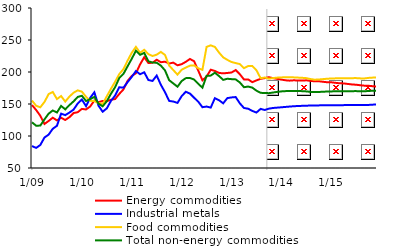
| Category | Energy commodities | Industrial metals | Food commodities | Total non-energy commodities |
|---|---|---|---|---|
|  1/09 | 148.368 | 84.244 | 155.29 | 121.375 |
| 2 | 140.587 | 81.429 | 147.196 | 116.049 |
| 3 | 131.575 | 85.939 | 144.868 | 116.307 |
| 4 | 118.821 | 97.654 | 153.203 | 125.93 |
| 5 | 123.49 | 102.128 | 165.445 | 134.898 |
| 6 | 128.606 | 111.311 | 168.793 | 139.885 |
| 7 | 124.331 | 115.961 | 157.75 | 136.723 |
| 8 | 128.514 | 134.928 | 162.407 | 147.012 |
| 9 | 125.026 | 132.617 | 153.77 | 141.634 |
| 10 | 129.397 | 136.603 | 161.586 | 148.247 |
| 11 | 135.879 | 141.211 | 167.652 | 154.078 |
| 12 | 137.215 | 150.766 | 171.339 | 161.026 |
|  1/10 | 142.356 | 156.985 | 169.298 | 162.848 |
| 2 | 141.46 | 146.691 | 161.28 | 154.731 |
| 3 | 146.147 | 159.641 | 154.948 | 157.505 |
| 4 | 155.508 | 168.291 | 154.706 | 161.124 |
| 5 | 152.816 | 147.383 | 151.358 | 150.602 |
| 6 | 154.771 | 137.917 | 150.12 | 146.431 |
| 7 | 154.405 | 143.15 | 162.09 | 154.366 |
| 8 | 156.612 | 154.951 | 173.778 | 166.045 |
| 9 | 157.739 | 163.172 | 184.769 | 176.337 |
| 10 | 165.782 | 176.163 | 196.798 | 190.619 |
| 11 | 172.845 | 175.509 | 204.537 | 197.056 |
| 12 | 186.122 | 184.213 | 217.756 | 208.974 |
|  1/11 | 193.869 | 192.364 | 230.087 | 220.692 |
| 2 | 197.964 | 201.464 | 239.263 | 233.195 |
| 3 | 211.893 | 196.53 | 230.085 | 226.858 |
| 4 | 223.102 | 199.532 | 234.656 | 229.779 |
| 5 | 213.988 | 187.434 | 227.889 | 216.723 |
| 6 | 214.452 | 186.085 | 224.999 | 214.766 |
| 7 | 219.204 | 194.4 | 227.097 | 214.509 |
| 8 | 215.285 | 180.068 | 231.394 | 209.923 |
| 9 | 216.157 | 168.386 | 226.624 | 202.501 |
| 10 | 213.279 | 154.791 | 210.039 | 187.143 |
| 11 | 214.612 | 153.854 | 203.002 | 182.111 |
| 12 | 210.467 | 151.68 | 195.899 | 177.03 |
|  1/12 | 212.204 | 162.262 | 203.531 | 185.791 |
| 2 | 215.894 | 169.142 | 206.888 | 190.422 |
| 3 | 220.371 | 166.249 | 209.923 | 190.656 |
| 4 | 216.813 | 159.747 | 210.376 | 188.243 |
| 5 | 202.149 | 153.634 | 205.76 | 181.496 |
| 6 | 186.988 | 144.988 | 203.483 | 175.531 |
| 7 | 192.826 | 146.023 | 239.257 | 193.968 |
| 8 | 203.584 | 144.429 | 241.659 | 194.371 |
| 9 | 201.636 | 159.123 | 239.16 | 198.892 |
| 10 | 198.55 | 155.876 | 230.298 | 193.599 |
| 11 | 197.876 | 151.08 | 222.877 | 187.719 |
| 12 | 198.509 | 159.232 | 218.961 | 189.446 |
|  1/13 | 199.213 | 160.268 | 215.635 | 188.838 |
| 2 | 203.008 | 160.884 | 213.914 | 188.464 |
| 3 | 196.504 | 150.989 | 212.418 | 183.66 |
| 4 | 188.297 | 143.751 | 205.957 | 176.229 |
| 5 | 188.4 | 142.633 | 209.217 | 177.291 |
| 6 | 184.13 | 139.203 | 209.43 | 175.584 |
| 7 | 186.898 | 136.655 | 202.636 | 170.834 |
| 8 | 189.337 | 142.363 | 190.269 | 167.446 |
| 9 | 190.478 | 140.665 | 191.401 | 167.195 |
| 10 | 191.869 | 142.74 | 189.559 | 166.928 |
| 11 | 190.328 | 143.782 | 190.517 | 167.957 |
| 12 | 189.262 | 144.342 | 191.194 | 168.91 |
|  1/14 | 188.109 | 144.882 | 191.572 | 169.699 |
| 2 | 187.021 | 145.432 | 191.736 | 170.122 |
| 3 | 186.475 | 146.003 | 191.768 | 170.326 |
| 4 | 187.03 | 146.503 | 191.594 | 170.417 |
| 5 | 186.693 | 146.874 | 191.249 | 170.378 |
| 6 | 186.542 | 147.131 | 190.926 | 170.06 |
| 7 | 187 | 147.359 | 190.4 | 169.682 |
| 8 | 186.148 | 147.597 | 188.951 | 168.955 |
| 9 | 185.389 | 147.73 | 187.999 | 168.574 |
| 10 | 185.569 | 147.834 | 188.287 | 168.788 |
| 11 | 184.714 | 147.944 | 188.887 | 169.158 |
| 12 | 184 | 148.009 | 189.471 | 169.489 |
|  1/15 | 183.932 | 148.03 | 189.852 | 169.694 |
| 2 | 183.12 | 148.056 | 190.057 | 169.81 |
| 3 | 182.347 | 148.15 | 190.164 | 169.895 |
| 4 | 182.168 | 148.24 | 190.226 | 169.961 |
| 5 | 181.313 | 148.347 | 190.299 | 170.041 |
| 6 | 180.547 | 148.362 | 190.412 | 170.104 |
| 7 | 180.095 | 148.377 | 190.446 | 170.128 |
| 8 | 179.299 | 148.418 | 190.038 | 169.94 |
| 9 | 178.613 | 148.474 | 189.975 | 169.922 |
| 10 | 178.425 | 148.576 | 190.818 | 170.334 |
| 11 | 177.771 | 148.98 | 191.24 | 170.703 |
| 12 | 177.265 | 149.397 | 191.307 | 170.883 |